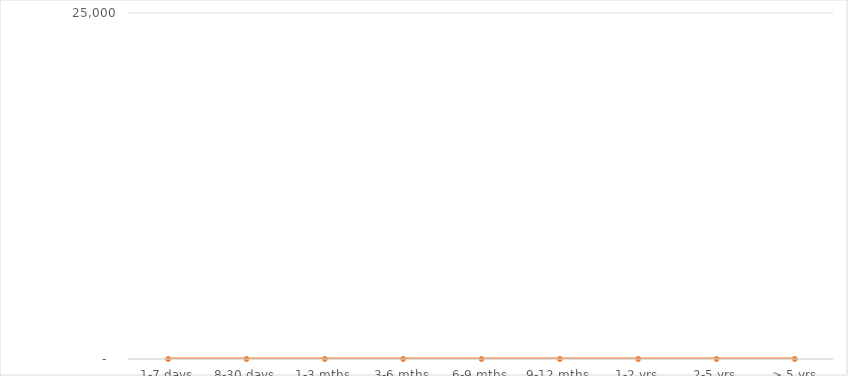
| Category | Period Gap |
|---|---|
|  1-7 days  | 0 |
|  8-30 days  | 0 |
|  1-3 mths  | 0 |
|  3-6 mths  | 0 |
|  6-9 mths  | 0 |
|  9-12 mths  | 0 |
|  1-2 yrs  | 0 |
|  2-5 yrs  | 0 |
|   > 5 yrs  | 0 |